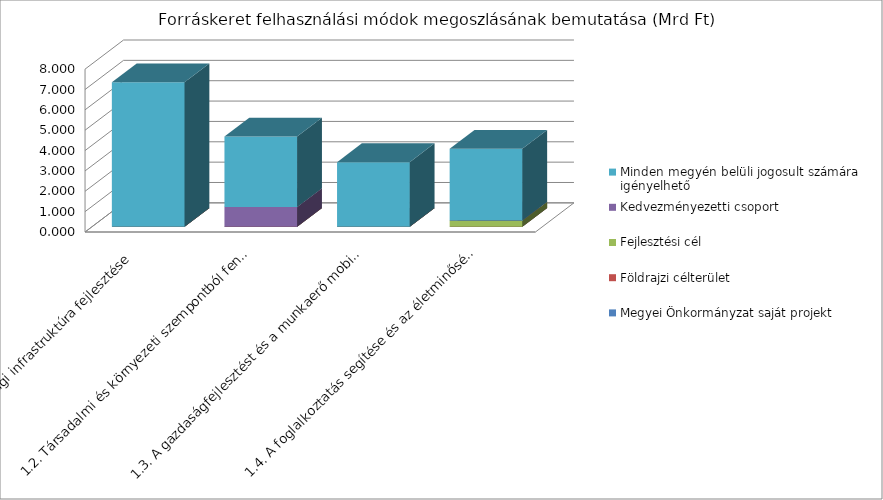
| Category | Megyei Önkormányzat saját projekt | Földrajzi célterület  | Fejlesztési cél  | Kedvezményezetti csoport | Minden megyén belüli jogosult számára igényelhető |
|---|---|---|---|---|---|
| 1.1. Helyi gazdasági infrastruktúra fejlesztése | 0 | 0 | 0 | 0 | 7.105 |
| 1.2. Társadalmi és környezeti szempontból fenntartható turizmusfejlesztés | 0 | 0 | 0 | 0.975 | 3.457 |
| 1.3. A gazdaságfejlesztést és a munkaerő mobilitás ösztönzését szolgáló közlekedésfejlesztés | 0 | 0 | 0 | 0 | 3.176 |
| 1.4. A foglalkoztatás segítése és az életminőség javítása családbarát, munkába állást segítő intézmények, közszolgáltatások fejlesztésével | 0 | 0 | 0.306 | 0 | 3.524 |